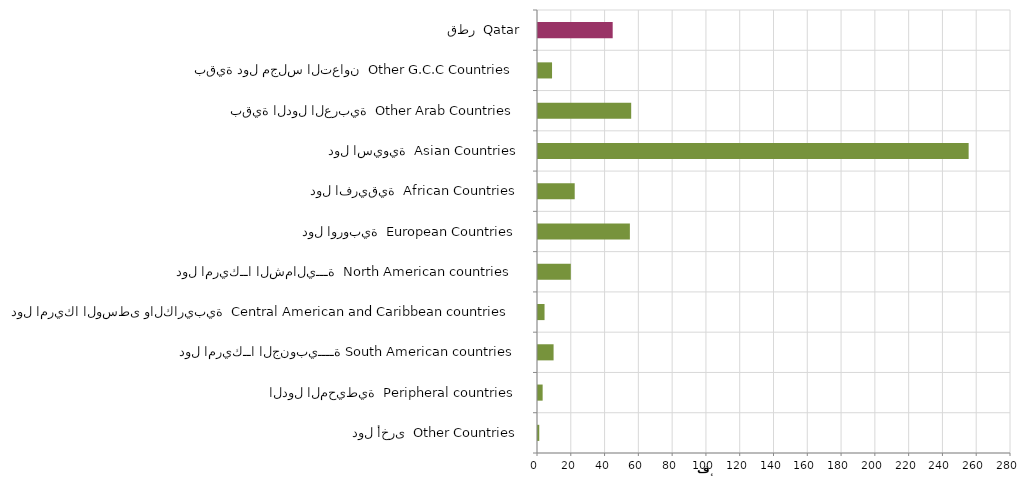
| Category | Series 0 |
|---|---|
| دول أخرى  Other Countries | 747 |
| الدول المحيطية  Peripheral countries | 2748 |
| دول امريكــا الجنوبيــــة South American countries | 9224 |
| دول امريكا الوسطى والكاريبية  Central American and Caribbean countries | 3871 |
| دول امريكــا الشماليـــة  North American countries  | 19425 |
| دول اوروبية  European Countries | 54390 |
| دول افريقية  African Countries | 21732 |
| دول اسيوية  Asian Countries | 254931 |
| بقية الدول العربية  Other Arab Countries | 55164 |
| بقية دول مجلس التعاون  Other G.C.C Countries | 8313 |
| قطر  Qatar | 44214 |